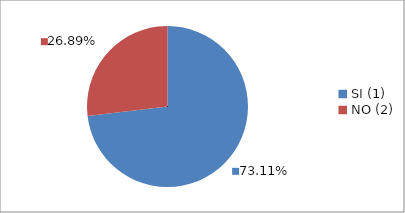
| Category | Series 0 |
|---|---|
| SI (1) | 0.731 |
| NO (2) | 0.269 |